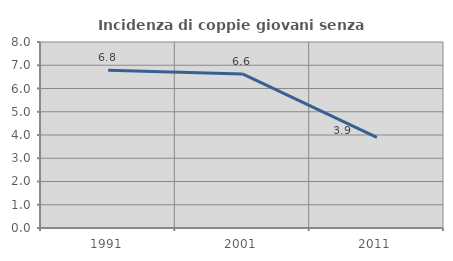
| Category | Incidenza di coppie giovani senza figli |
|---|---|
| 1991.0 | 6.785 |
| 2001.0 | 6.626 |
| 2011.0 | 3.899 |